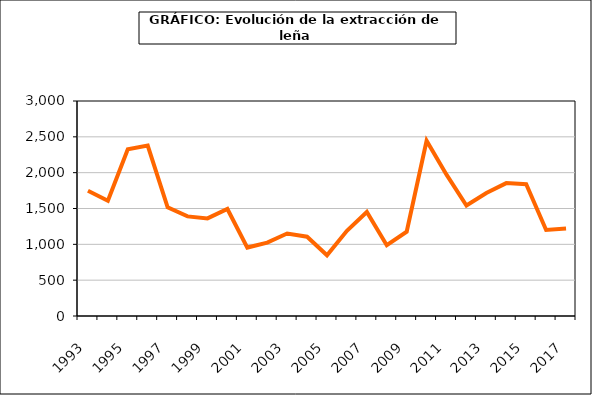
| Category | Series 0 |
|---|---|
| 1993.0 | 1748 |
| 1994.0 | 1609 |
| 1995.0 | 2325 |
| 1996.0 | 2377 |
| 1997.0 | 1516 |
| 1998.0 | 1390 |
| 1999.0 | 1362 |
| 2000.0 | 1493 |
| 2001.0 | 955 |
| 2002.0 | 1024 |
| 2003.0 | 1151 |
| 2004.0 | 1106 |
| 2005.0 | 848 |
| 2006.0 | 1189 |
| 2007.0 | 1451 |
| 2008.0 | 988 |
| 2009.0 | 1175.249 |
| 2010.0 | 2444.913 |
| 2011.0 | 1971.599 |
| 2012.0 | 1541.774 |
| 2013.0 | 1716.337 |
| 2014.0 | 1854.045 |
| 2015.0 | 1839.98 |
| 2016.0 | 1200.867 |
| 2017.0 | 1221.607 |